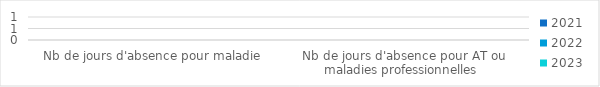
| Category | 2021 | 2022 | 2023 |
|---|---|---|---|
| Nb de jours d'absence pour maladie | 0 | 0 | 0 |
| Nb de jours d'absence pour AT ou maladies professionnelles  | 0 | 0 | 0 |